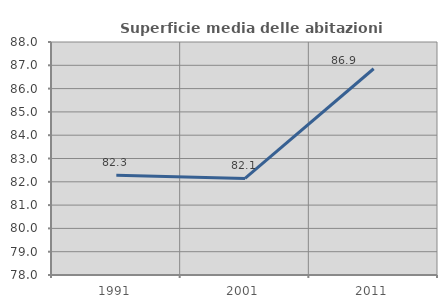
| Category | Superficie media delle abitazioni occupate |
|---|---|
| 1991.0 | 82.278 |
| 2001.0 | 82.146 |
| 2011.0 | 86.852 |